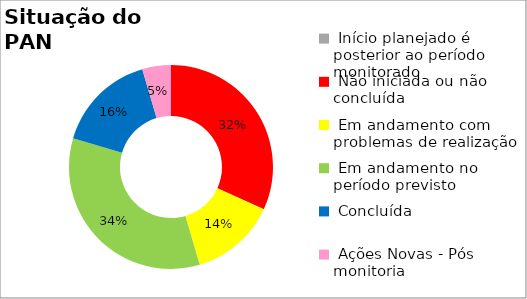
| Category | Series 0 |
|---|---|
|  Início planejado é posterior ao período monitorado | 0 |
|  Não iniciada ou não concluída | 0.318 |
|  Em andamento com problemas de realização | 0.136 |
|  Em andamento no período previsto  | 0.341 |
|  Concluída | 0.159 |
|  Ações Novas - Pós monitoria | 0.045 |